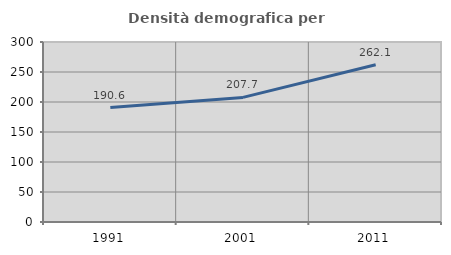
| Category | Densità demografica |
|---|---|
| 1991.0 | 190.65 |
| 2001.0 | 207.664 |
| 2011.0 | 262.12 |